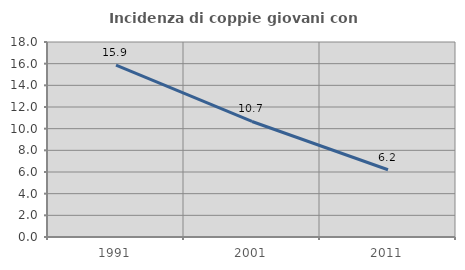
| Category | Incidenza di coppie giovani con figli |
|---|---|
| 1991.0 | 15.87 |
| 2001.0 | 10.665 |
| 2011.0 | 6.21 |